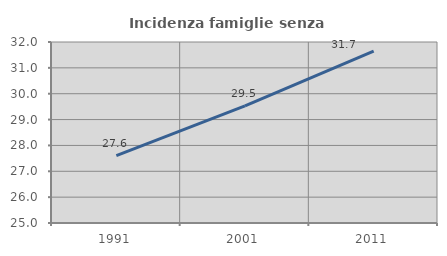
| Category | Incidenza famiglie senza nuclei |
|---|---|
| 1991.0 | 27.607 |
| 2001.0 | 29.528 |
| 2011.0 | 31.65 |